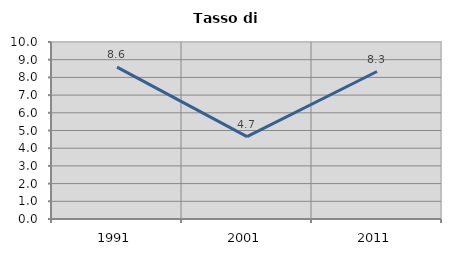
| Category | Tasso di disoccupazione   |
|---|---|
| 1991.0 | 8.581 |
| 2001.0 | 4.651 |
| 2011.0 | 8.333 |